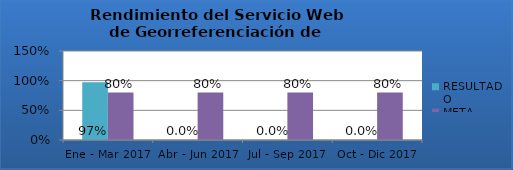
| Category | RESULTADO | META |
|---|---|---|
| Ene - Mar 2017 | 0.975 | 0.8 |
| Abr - Jun 2017 | 0 | 0.8 |
| Jul - Sep 2017 | 0 | 0.8 |
| Oct - Dic 2017 | 0 | 0.8 |